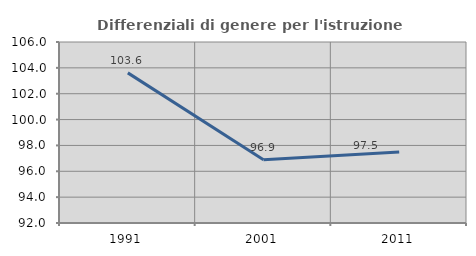
| Category | Differenziali di genere per l'istruzione superiore |
|---|---|
| 1991.0 | 103.612 |
| 2001.0 | 96.89 |
| 2011.0 | 97.486 |